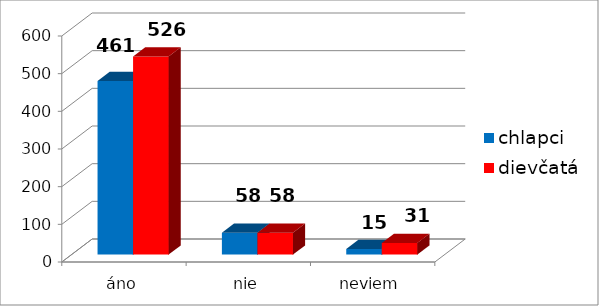
| Category | chlapci | dievčatá |
|---|---|---|
| áno | 461 | 526 |
| nie | 58 | 58 |
| neviem | 15 | 31 |